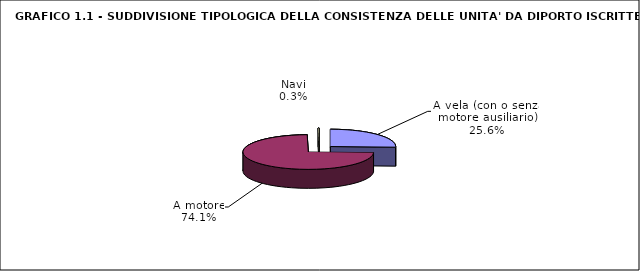
| Category | Series 0 |
|---|---|
| A vela (con o senza motore ausiliario) | 18440 |
| A motore | 53427 |
| Navi | 192 |